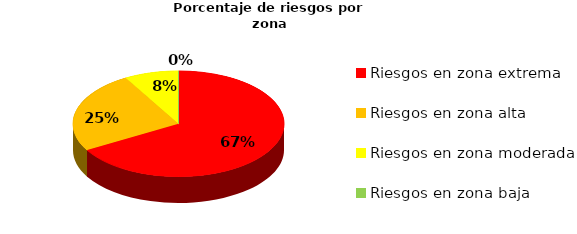
| Category | Series 0 | Series 1 |
|---|---|---|
| Riesgos en zona extrema | 8 | 0.667 |
| Riesgos en zona alta | 3 | 0.25 |
| Riesgos en zona moderada | 1 | 0.083 |
| Riesgos en zona baja | 0 | 0 |